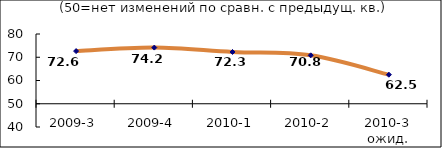
| Category | Диф.индекс ↓ |
|---|---|
| 2009-3 | 72.645 |
| 2009-4 | 74.155 |
| 2010-1 | 72.27 |
| 2010-2 | 70.83 |
| 2010-3 ожид. | 62.5 |